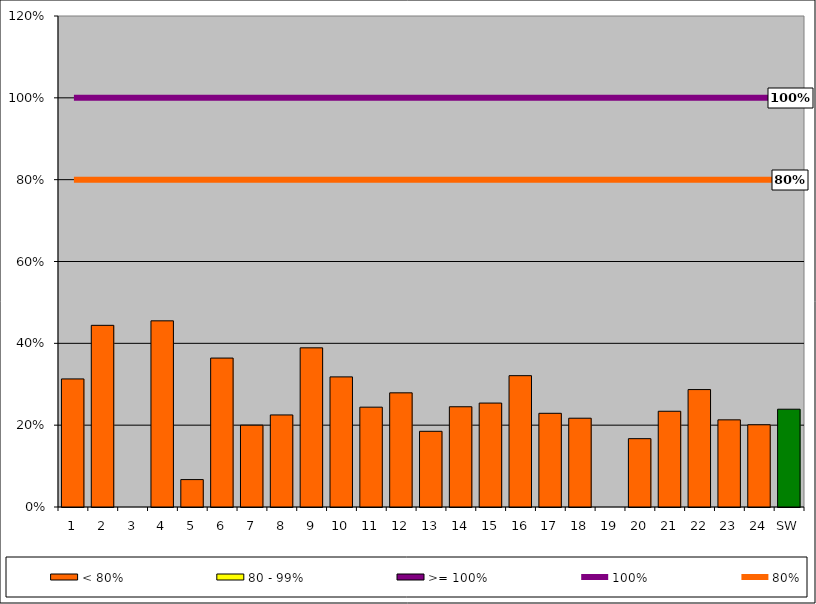
| Category | < 80% | 80 - 99% | >= 100% |
|---|---|---|---|
| 1 | 0.313 | 0 | 0 |
| 2 | 0.444 | 0 | 0 |
| 3 | 0 | 0 | 0 |
| 4 | 0.455 | 0 | 0 |
| 5 | 0.067 | 0 | 0 |
| 6 | 0.364 | 0 | 0 |
| 7 | 0.2 | 0 | 0 |
| 8 | 0.225 | 0 | 0 |
| 9 | 0.389 | 0 | 0 |
| 10 | 0.318 | 0 | 0 |
| 11 | 0.244 | 0 | 0 |
| 12 | 0.279 | 0 | 0 |
| 13 | 0.185 | 0 | 0 |
| 14 | 0.245 | 0 | 0 |
| 15 | 0.254 | 0 | 0 |
| 16 | 0.321 | 0 | 0 |
| 17 | 0.229 | 0 | 0 |
| 18 | 0.217 | 0 | 0 |
| 19 | 0 | 0 | 0 |
| 20 | 0.167 | 0 | 0 |
| 21 | 0.234 | 0 | 0 |
| 22 | 0.287 | 0 | 0 |
| 23 | 0.213 | 0 | 0 |
| 24 | 0.201 | 0 | 0 |
| SW | 0.239 | 0 | 0 |